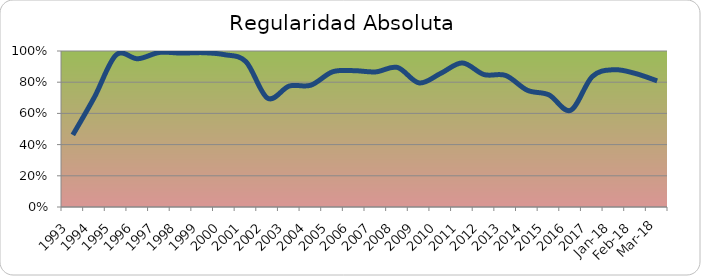
| Category | Series 0 |
|---|---|
| 1993.0 | 0.462 |
| 1994.0 | 0.705 |
| 1995.0 | 0.975 |
| 1996.0 | 0.95 |
| 1997.0 | 0.991 |
| 1998.0 | 0.986 |
| 1999.0 | 0.989 |
| 2000.0 | 0.977 |
| 2001.0 | 0.931 |
| 2002.0 | 0.697 |
| 2003.0 | 0.775 |
| 2004.0 | 0.781 |
| 2005.0 | 0.867 |
| 2006.0 | 0.874 |
| 2007.0 | 0.866 |
| 2008.0 | 0.894 |
| 2009.0 | 0.795 |
| 2010.0 | 0.857 |
| 2011.0 | 0.924 |
| 2012.0 | 0.849 |
| 2013.0 | 0.843 |
| 2014.0 | 0.748 |
| 2015.0 | 0.719 |
| 2016.0 | 0.62 |
| 2017.0 | 0.836 |
| 43101.0 | 0.88 |
| 43132.0 | 0.856 |
| 43160.0 | 0.808 |